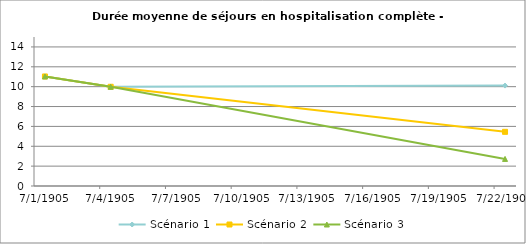
| Category | Scénario 1 | Scénario 2 | Scénario 3 |
|---|---|---|---|
| 2009.0 | 11.028 | 11.028 | 11.028 |
| 2012.0 | 9.989 | 9.989 | 9.989 |
| 2030.0 | 10.109 | 5.453 | 2.726 |